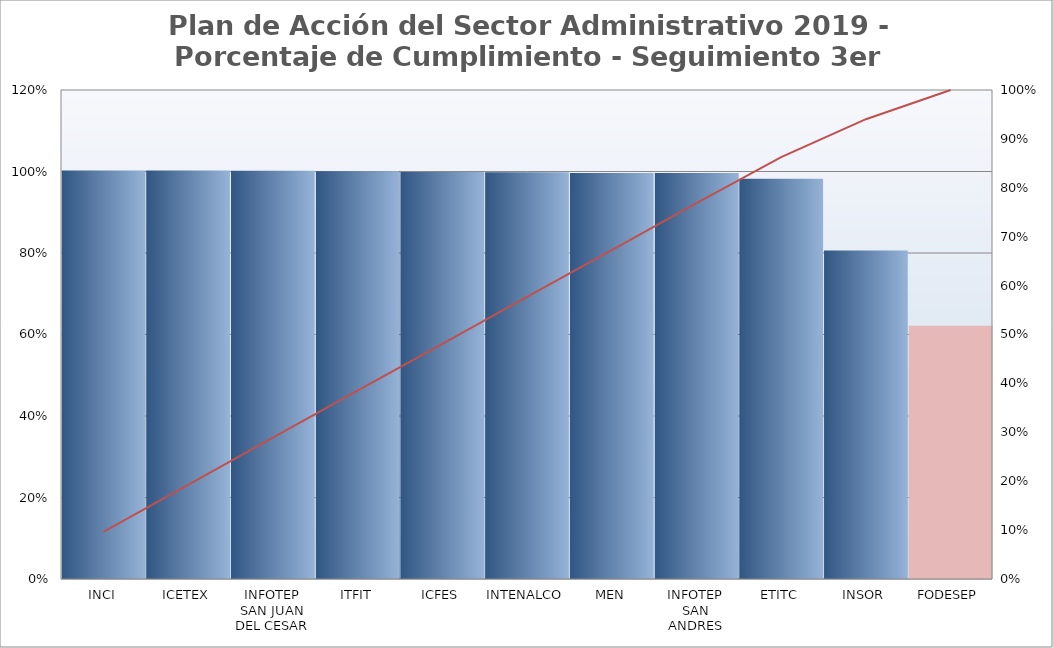
| Category | Promedio por Meta |
|---|---|
| Grupo 1 | 1 |
| Grupo 2 | 1 |
| Grupo 3 | 1 |